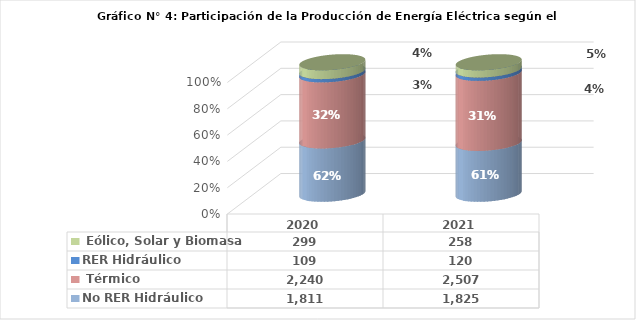
| Category | No RER | RER |
|---|---|---|
| 2020.0 | 2240.268 | 298.829 |
| 2021.0 | 2507.345 | 257.691 |